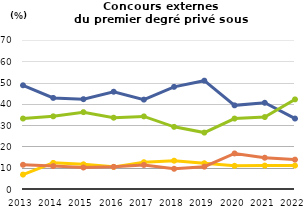
| Category | Étudiants | Enseignants et personnels d'éducation et de surveillance                            | Autres emplois dans secteurs public ou privé                | Sans emploi                    |
|---|---|---|---|---|
| 2013.0 | 48.736 | 33.103 | 6.782 | 11.379 |
| 2014.0 | 42.794 | 34.148 | 12.281 | 10.777 |
| 2015.0 | 42.2 | 36.1 | 11.6 | 10.1 |
| 2016.0 | 45.7 | 33.5 | 10.4 | 10.4 |
| 2017.0 | 42 | 34.1 | 12.6 | 11.3 |
| 2018.0 | 48 | 29.2 | 13.3 | 9.5 |
| 2019.0 | 50.9 | 26.5 | 12.1 | 10.5 |
| 2020.0 | 39.3 | 33.1 | 10.9 | 16.7 |
| 2021.0 | 40.5 | 33.8 | 11 | 14.7 |
| 2022.0 | 33.1 | 42.1 | 11 | 13.8 |